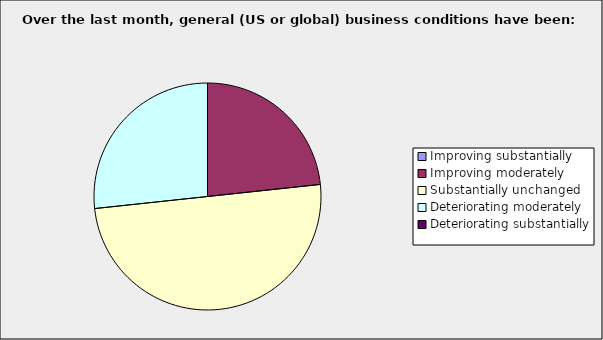
| Category | Series 0 |
|---|---|
| Improving substantially | 0 |
| Improving moderately | 0.233 |
| Substantially unchanged | 0.5 |
| Deteriorating moderately | 0.267 |
| Deteriorating substantially | 0 |